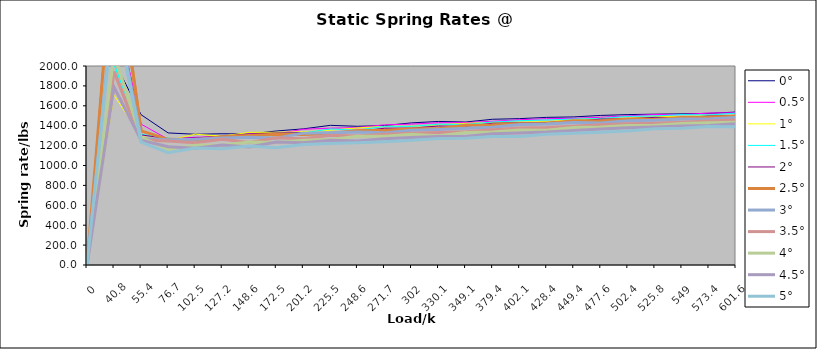
| Category | 0° | 0.5° | 1° | 1.5° | 2° | 2.5° | 3° | 3.5° | 4° | 4.5° | 5° |
|---|---|---|---|---|---|---|---|---|---|---|---|
| 0.0 | 0 | 0 | 0 | 0 | 0 | 0 | 0 | 0 | 0 | 0 | 0 |
| 40.8 | 2054.703 | 2652.277 | 1708.493 | 2018.085 | 3385.056 | 3282.333 | 2670.778 | 1944.348 | 2110.707 | 1787.329 | 2628.489 |
| 55.4 | 1510.663 | 1415.944 | 1289.225 | 1313 | 1307.9 | 1347.19 | 1271.928 | 1256.513 | 1283.913 | 1254.644 | 1233.655 |
| 76.7 | 1327.409 | 1264.485 | 1251.417 | 1275.796 | 1268.761 | 1263.047 | 1258.157 | 1247 | 1162.215 | 1189.331 | 1129.023 |
| 102.5 | 1314.163 | 1283.991 | 1314.849 | 1232.698 | 1277.015 | 1258.701 | 1263.611 | 1229.068 | 1202.697 | 1173.553 | 1176.784 |
| 127.2 | 1319.199 | 1291.024 | 1294.471 | 1297.167 | 1294.689 | 1288.834 | 1276.703 | 1263.784 | 1204.151 | 1206.118 | 1168.402 |
| 148.6 | 1316.441 | 1317.827 | 1333.136 | 1277.225 | 1315.243 | 1301.757 | 1282.866 | 1231.824 | 1235.17 | 1186.269 | 1195.639 |
| 172.5 | 1346.753 | 1317.643 | 1333.821 | 1322.043 | 1326.965 | 1313.349 | 1275.265 | 1278.838 | 1231.064 | 1235.576 | 1178.304 |
| 201.2 | 1368.258 | 1364.122 | 1338.764 | 1326.966 | 1328.705 | 1312.753 | 1325.255 | 1269.701 | 1254.756 | 1228.208 | 1209.972 |
| 225.5 | 1403.725 | 1375.25 | 1353.819 | 1367.171 | 1331.577 | 1321.273 | 1328.509 | 1303.001 | 1262.422 | 1254.596 | 1221.299 |
| 248.6 | 1393.856 | 1381.092 | 1378.064 | 1354.059 | 1341.491 | 1352.802 | 1336.762 | 1296.964 | 1293.009 | 1246.303 | 1228.917 |
| 271.7 | 1401.11 | 1408.944 | 1393.208 | 1393.5 | 1374.436 | 1351.897 | 1327.93 | 1313.864 | 1293.069 | 1269.578 | 1239.207 |
| 302.0 | 1428.24 | 1415.57 | 1394.464 | 1392.873 | 1375.753 | 1368.634 | 1354.5 | 1322.996 | 1314.571 | 1281.361 | 1253.235 |
| 330.1 | 1442.736 | 1430.072 | 1408.872 | 1414.498 | 1396.853 | 1368.762 | 1361.152 | 1330.659 | 1298.427 | 1292.141 | 1271.306 |
| 349.1 | 1437.017 | 1430.974 | 1424.418 | 1413.298 | 1392.879 | 1405.108 | 1373.487 | 1339.593 | 1331.647 | 1292.548 | 1275.014 |
| 379.4 | 1464.673 | 1444.472 | 1433.226 | 1436.885 | 1425.185 | 1407.991 | 1384.155 | 1359.944 | 1336.492 | 1318.64 | 1290.424 |
| 402.1 | 1471.033 | 1460.015 | 1435.835 | 1450.222 | 1429.743 | 1418.48 | 1410.892 | 1376.688 | 1357.524 | 1327.46 | 1292.647 |
| 428.4 | 1483.74 | 1470.616 | 1441.236 | 1457.845 | 1433.706 | 1422.97 | 1417.286 | 1381.04 | 1353.823 | 1336.384 | 1313.558 |
| 449.4 | 1488.238 | 1474.235 | 1462.124 | 1467.13 | 1442.123 | 1450.981 | 1433.067 | 1395.157 | 1381.702 | 1352.4 | 1323.113 |
| 477.6 | 1503.257 | 1484.48 | 1473.448 | 1471.971 | 1466.65 | 1447.917 | 1427.414 | 1408.727 | 1386.145 | 1367.717 | 1334.405 |
| 502.4 | 1511.526 | 1499.231 | 1475.418 | 1494.141 | 1470.713 | 1466.358 | 1449.951 | 1419.917 | 1401.954 | 1378.812 | 1346.731 |
| 525.8 | 1515.844 | 1512.84 | 1491.606 | 1497.687 | 1483.942 | 1462.647 | 1455.28 | 1424.294 | 1405.018 | 1385.887 | 1369.976 |
| 549.0 | 1519.262 | 1512.799 | 1492.741 | 1512.248 | 1481.648 | 1482.286 | 1468.105 | 1435.107 | 1422.862 | 1396.101 | 1374.676 |
| 573.4 | 1524.159 | 1526.774 | 1500.433 | 1507.087 | 1497.562 | 1484.82 | 1467.279 | 1446.425 | 1429.988 | 1402.408 | 1391.145 |
| 601.6 | 1536.995 | 1530.644 | 1504.113 | 1526.412 | 1501.828 | 1496.541 | 1482.629 | 1457.191 | 1435.516 | 1419.018 | 1390.643 |